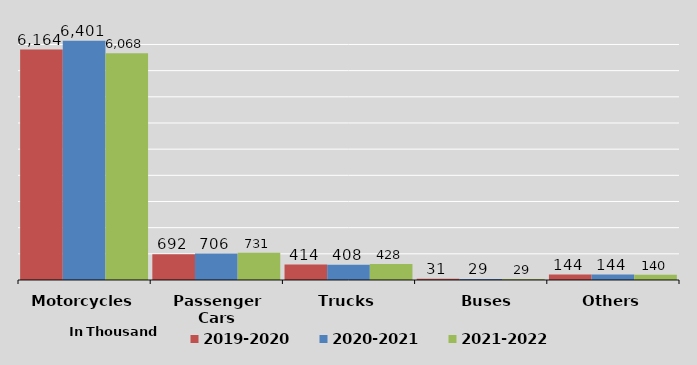
| Category | 2019-2020 | 2020-2021 | 2021-2022 |
|---|---|---|---|
| Motorcycles | 6164 | 6401 | 6068 |
| Passenger Cars | 692 | 706 | 731 |
| Trucks | 414 | 408 | 428 |
|    Buses | 31 | 29 | 29 |
|    Others    | 144 | 144 | 140 |